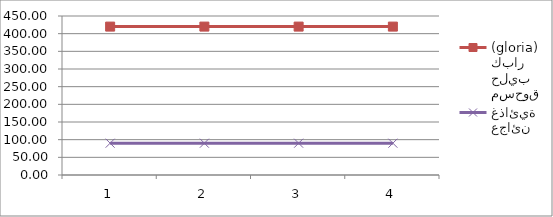
| Category | مسحوق حليب كبار (gloria) | عجائن غذائية |
|---|---|---|
| 0 | 420 | 90 |
| 1 | 420 | 90 |
| 2 | 420 | 90 |
| 3 | 420 | 90 |